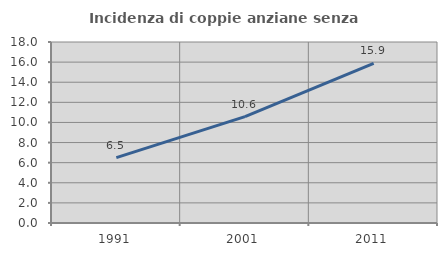
| Category | Incidenza di coppie anziane senza figli  |
|---|---|
| 1991.0 | 6.5 |
| 2001.0 | 10.58 |
| 2011.0 | 15.873 |